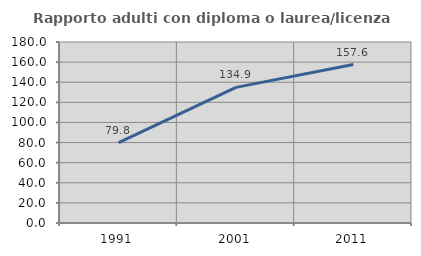
| Category | Rapporto adulti con diploma o laurea/licenza media  |
|---|---|
| 1991.0 | 79.845 |
| 2001.0 | 134.875 |
| 2011.0 | 157.565 |